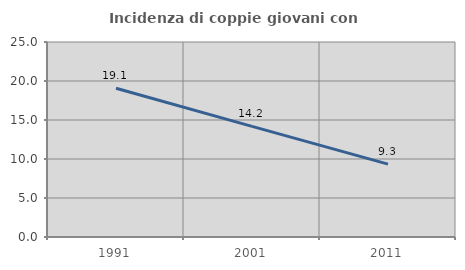
| Category | Incidenza di coppie giovani con figli |
|---|---|
| 1991.0 | 19.075 |
| 2001.0 | 14.18 |
| 2011.0 | 9.343 |